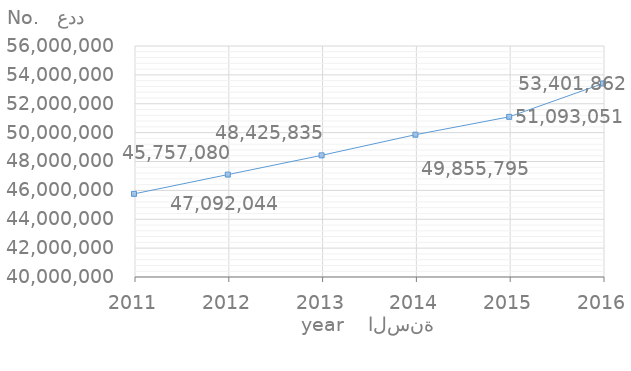
| Category | القيمة
Value |
|---|---|
| 2016.0 | 53401862 |
| 2015.0 | 51093051 |
| 2014.0 | 49855795 |
| 2013.0 | 48425835 |
| 2012.0 | 47092044 |
| 2011.0 | 45757080 |